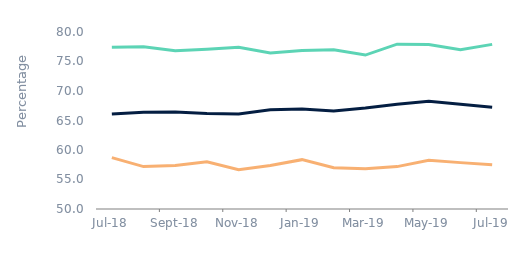
| Category | First-time
buyers | Homemovers | Remortgagers |
|---|---|---|---|
| 2018-07-01 | 77.407 | 66.084 | 58.707 |
| 2018-08-01 | 77.487 | 66.411 | 57.187 |
| 2018-09-01 | 76.828 | 66.439 | 57.356 |
| 2018-10-01 | 77.064 | 66.188 | 58.009 |
| 2018-11-01 | 77.402 | 66.095 | 56.671 |
| 2018-12-01 | 76.439 | 66.823 | 57.388 |
| 2019-01-01 | 76.858 | 66.947 | 58.365 |
| 2019-02-01 | 77.007 | 66.623 | 56.991 |
| 2019-03-01 | 76.093 | 67.115 | 56.841 |
| 2019-04-01 | 77.934 | 67.768 | 57.183 |
| 2019-05-01 | 77.866 | 68.241 | 58.263 |
| 2019-06-01 | 76.984 | 67.744 | 57.86 |
| 2019-07-01 | 77.904 | 67.256 | 57.484 |